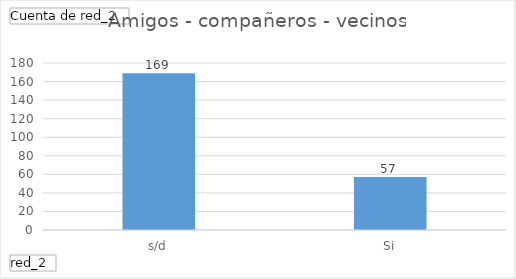
| Category | Total |
|---|---|
| s/d | 169 |
| Si | 57 |